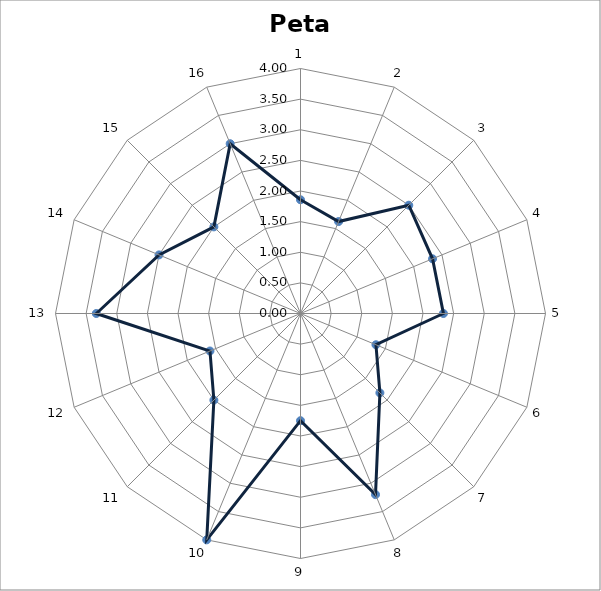
| Category | Series 0 |
|---|---|
| 0 | 1.857 |
| 1 | 1.625 |
| 2 | 2.5 |
| 3 | 2.333 |
| 4 | 2.333 |
| 5 | 1.333 |
| 6 | 1.833 |
| 7 | 3.2 |
| 8 | 1.75 |
| 9 | 4 |
| 10 | 2 |
| 11 | 1.6 |
| 12 | 3.333 |
| 13 | 2.5 |
| 14 | 2 |
| 15 | 3 |